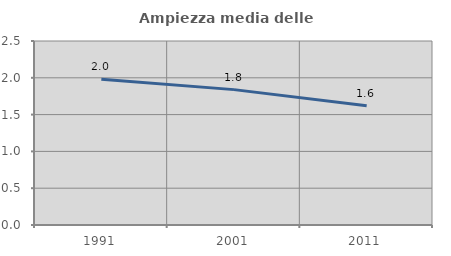
| Category | Ampiezza media delle famiglie |
|---|---|
| 1991.0 | 1.981 |
| 2001.0 | 1.839 |
| 2011.0 | 1.621 |